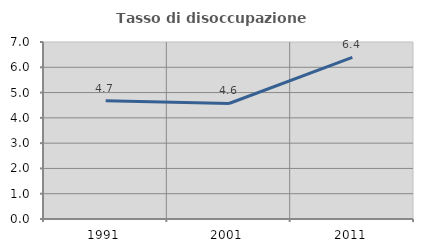
| Category | Tasso di disoccupazione giovanile  |
|---|---|
| 1991.0 | 4.673 |
| 2001.0 | 4.569 |
| 2011.0 | 6.395 |